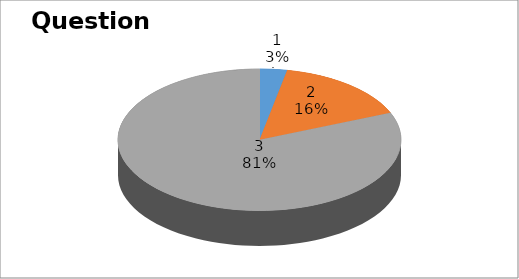
| Category | Series 0 |
|---|---|
| 0 | 1 |
| 1 | 5 |
| 2 | 26 |